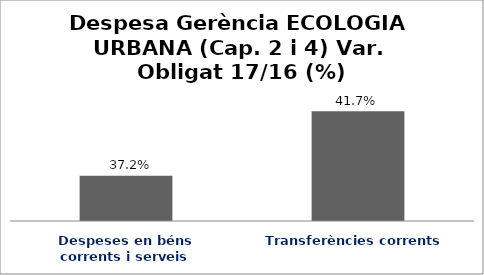
| Category | Series 0 |
|---|---|
| Despeses en béns corrents i serveis | 0.372 |
| Transferències corrents | 0.417 |